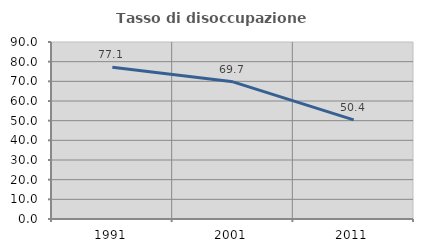
| Category | Tasso di disoccupazione giovanile  |
|---|---|
| 1991.0 | 77.13 |
| 2001.0 | 69.748 |
| 2011.0 | 50.37 |